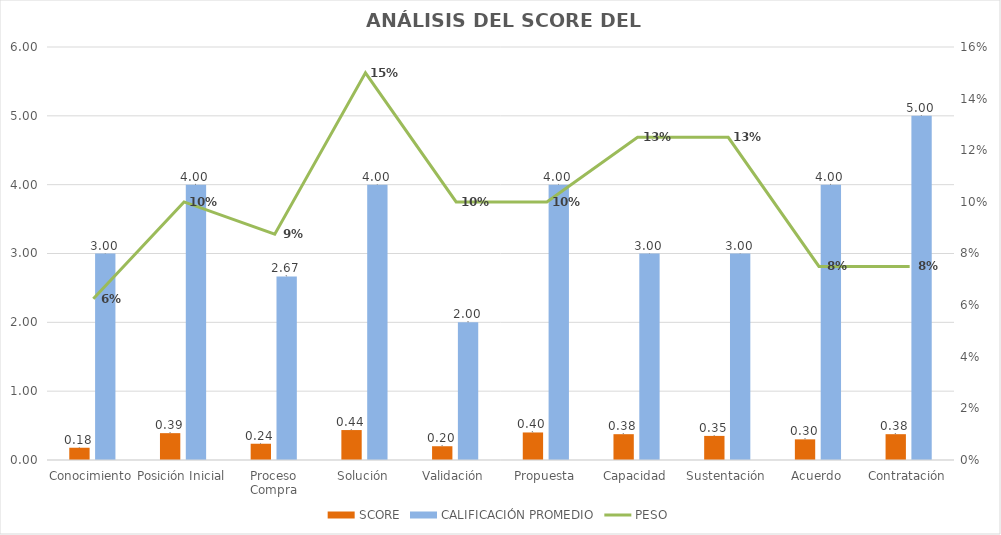
| Category | SCORE | CALIFICACIÓN PROMEDIO |
|---|---|---|
| Conocimiento | 0.178 | 3 |
| Posición Inicial | 0.39 | 4 |
| Proceso Compra | 0.236 | 2.667 |
| Solución | 0.435 | 4 |
| Validación | 0.2 | 2 |
| Propuesta | 0.4 | 4 |
| Capacidad | 0.375 | 3 |
| Sustentación | 0.35 | 3 |
| Acuerdo | 0.3 | 4 |
| Contratación | 0.375 | 5 |